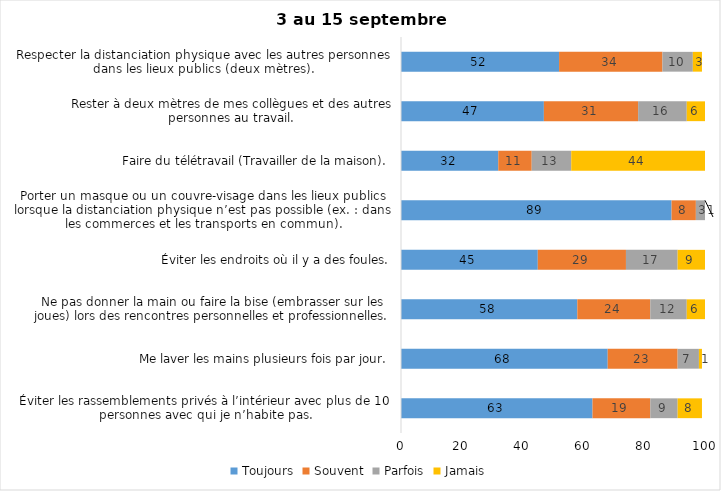
| Category | Toujours | Souvent | Parfois | Jamais |
|---|---|---|---|---|
| Éviter les rassemblements privés à l’intérieur avec plus de 10 personnes avec qui je n’habite pas. | 63 | 19 | 9 | 8 |
| Me laver les mains plusieurs fois par jour. | 68 | 23 | 7 | 1 |
| Ne pas donner la main ou faire la bise (embrasser sur les joues) lors des rencontres personnelles et professionnelles. | 58 | 24 | 12 | 6 |
| Éviter les endroits où il y a des foules. | 45 | 29 | 17 | 9 |
| Porter un masque ou un couvre-visage dans les lieux publics lorsque la distanciation physique n’est pas possible (ex. : dans les commerces et les transports en commun). | 89 | 8 | 3 | 1 |
| Faire du télétravail (Travailler de la maison). | 32 | 11 | 13 | 44 |
| Rester à deux mètres de mes collègues et des autres personnes au travail. | 47 | 31 | 16 | 6 |
| Respecter la distanciation physique avec les autres personnes dans les lieux publics (deux mètres). | 52 | 34 | 10 | 3 |